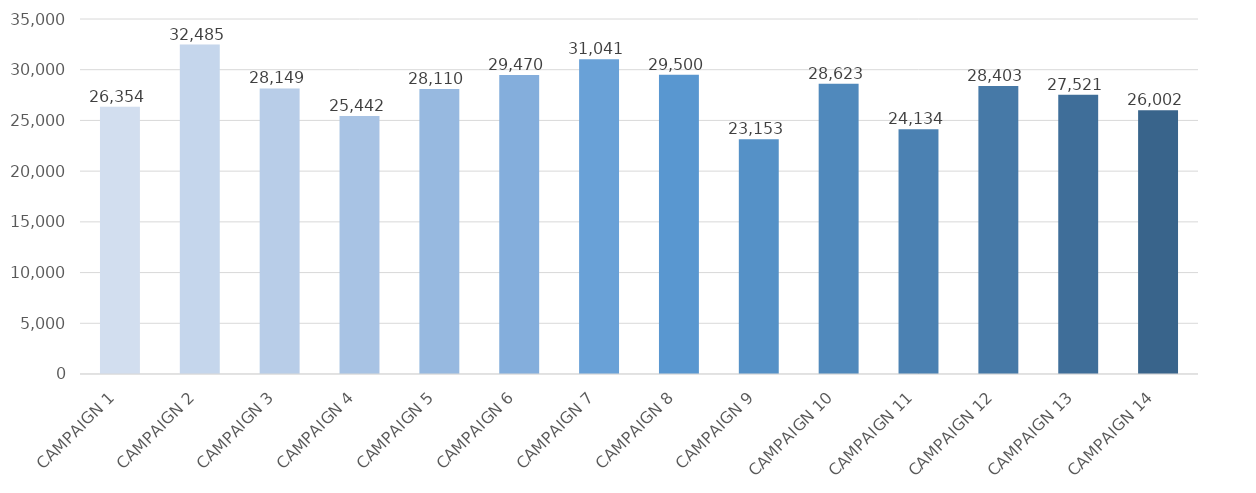
| Category | YTD CLICKS |
|---|---|
| CAMPAIGN 1 | 26354 |
| CAMPAIGN 2 | 32485 |
| CAMPAIGN 3 | 28149 |
| CAMPAIGN 4 | 25442 |
| CAMPAIGN 5 | 28110 |
| CAMPAIGN 6 | 29470 |
| CAMPAIGN 7 | 31041 |
| CAMPAIGN 8 | 29500 |
| CAMPAIGN 9 | 23153 |
| CAMPAIGN 10 | 28623 |
| CAMPAIGN 11 | 24134 |
| CAMPAIGN 12 | 28403 |
| CAMPAIGN 13 | 27521 |
| CAMPAIGN 14 | 26002 |